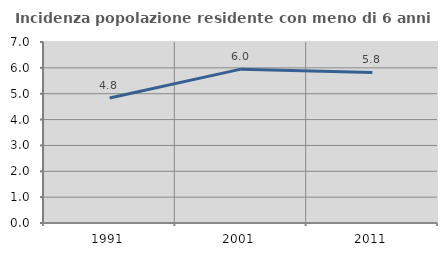
| Category | Incidenza popolazione residente con meno di 6 anni |
|---|---|
| 1991.0 | 4.837 |
| 2001.0 | 5.951 |
| 2011.0 | 5.824 |